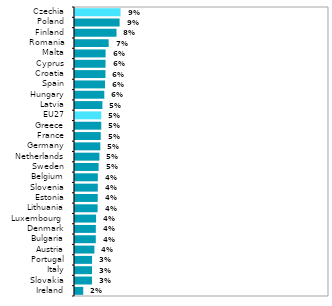
| Category | Series 1 |
|---|---|
| Ireland | 0.016 |
| Slovakia | 0.033 |
| Italy | 0.033 |
| Portugal | 0.034 |
| Austria | 0.038 |
| Bulgaria | 0.041 |
| Denmark | 0.041 |
| Luxembourg  | 0.042 |
| Lithuania | 0.044 |
| Estonia | 0.045 |
| Slovenia | 0.045 |
| Belgium | 0.045 |
| Sweden | 0.046 |
| Netherlands | 0.048 |
| Germany | 0.05 |
| France | 0.051 |
| Greece | 0.052 |
| EU27 | 0.052 |
| Latvia | 0.054 |
| Hungary | 0.058 |
| Spain | 0.059 |
| Croatia | 0.06 |
| Cyprus | 0.06 |
| Malta | 0.06 |
| Romania | 0.066 |
| Finland | 0.082 |
| Poland | 0.088 |
| Czechia | 0.09 |